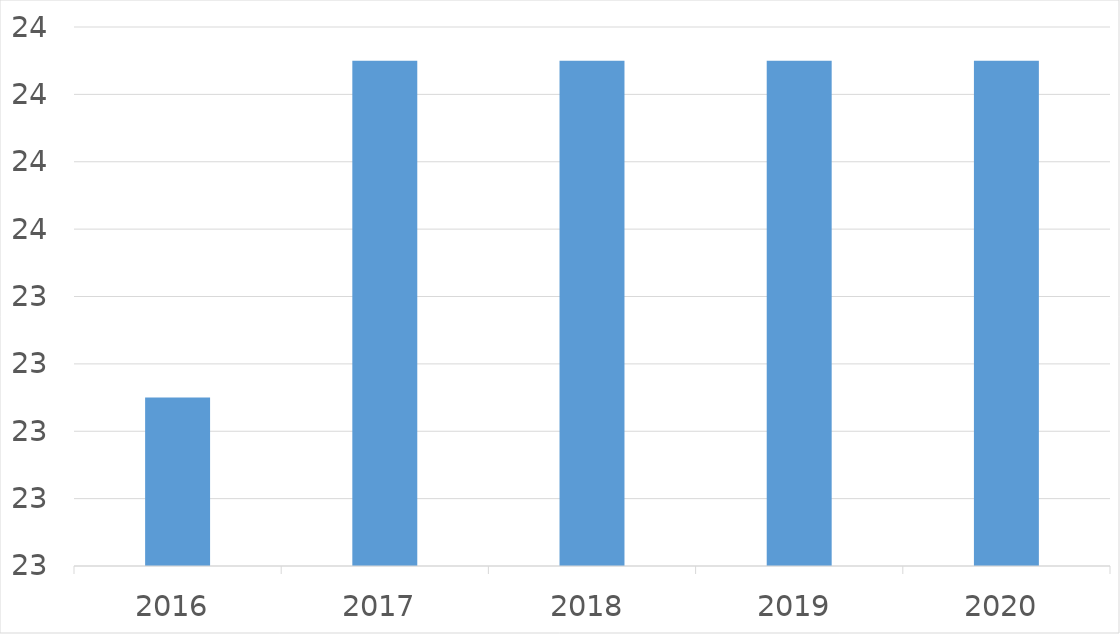
| Category | Series 0 |
|---|---|
| 2016 | 23 |
| 2017 | 24 |
| 2018 | 24 |
| 2019 | 24 |
| 2020 | 24 |